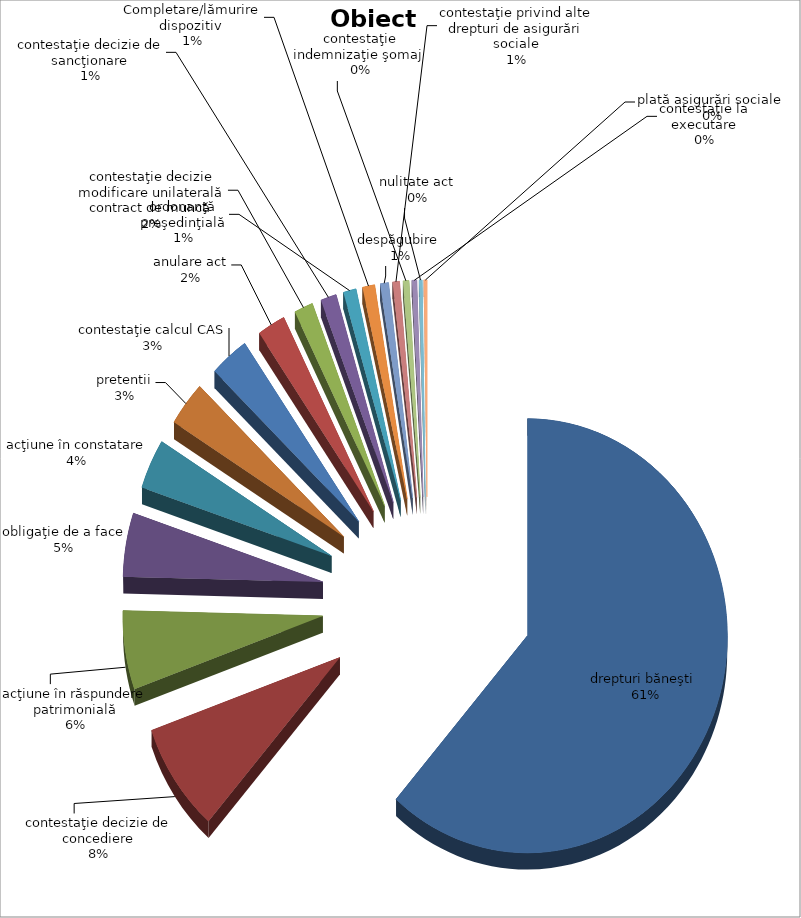
| Category | Series 0 |
|---|---|
| drepturi băneşti  | 16311 |
| contestaţie decizie de concediere | 2160 |
| acţiune în răspundere patrimonială | 1551 |
| obligaţie de a face | 1258 |
| acţiune în constatare | 986 |
| pretentii | 887 |
| contestaţie calcul CAS | 837 |
| anulare act | 600 |
| contestaţie decizie modificare unilaterală contract de muncă | 402 |
| contestaţie decizie de sancţionare | 338 |
| ordonanţă preşedinţială | 274 |
| Completare/lămurire dispozitiv  | 261 |
| despăgubire  | 180 |
| contestaţie privind alte drepturi de asigurări sociale | 147 |
| contestaţie indemnizaţie şomaj  | 128 |
| contestaţie la executare | 104 |
| nulitate act | 68 |
| plată asigurări sociale  | 67 |